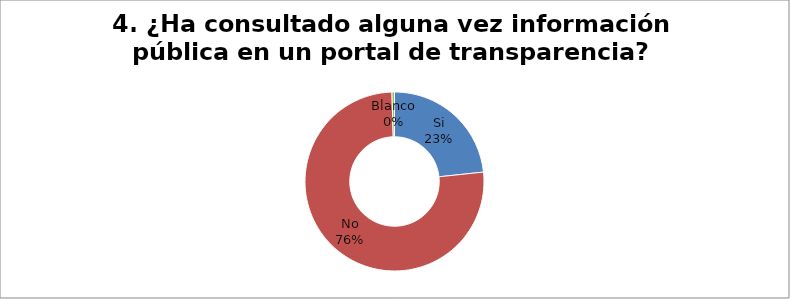
| Category | Series 0 |
|---|---|
| Si | 0.233 |
| No | 0.762 |
| Blanco | 0.005 |